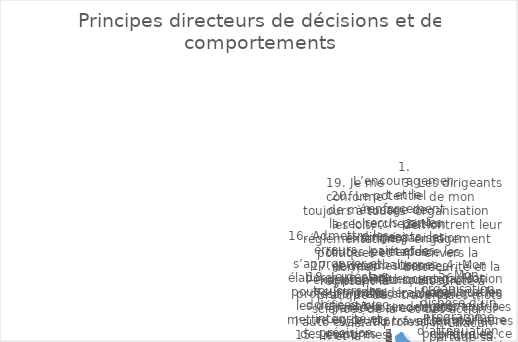
| Category | Series 0 |
|---|---|
| 1. L’encouragement et le renforcement reçus par les dirigeants, les pairs et les subalternes influencent considérablement le rendement au travail. | 2 |
| 2. Mon organisation renforce les normes éthiques et un code de conduite professionnel. | 0 |
| 3. Les dirigeants de mon organisation démontrent leur engagement envers la biosécurité et la biosûreté à travers des mots et des actions. | 0 |
| 4. Mon organisation applique les leçons apprises et les meilleures pratiques. | 1 |
| 5. Mon organisation dispose d’un programme d’atténuation des menaces internes. | 1 |
| 6. Mon organisation promeut la transparence publique en ce qui concerne sa conformité aux exigences de biosécurité et de biosûreté. | 0 |
| 7. Chacun partage sa responsabilité personnelle en matière de de biosécurité et de biosûreté. | 3 |
| 8. Je connais le concept et les implications de la recherche préoccupante à double usage. | 5 |
| 9. Des personnes dûment qualifiées et formées assurent la surveillance de la biosécurité et de la biosûreté. | 5 |
| 10. Lorsqu’un incident ou un quasi-accident se produit, les gens procèdent à un remue-méninge au lieu de se blâmer. La question posée est « qu’est-ce qui a mal tourné ? » pas « qui avait tort ? », en se concentrant sur l’amélioration, pas sur le blâme. | 4 |
| 11. Je considère les implications et les applications possibles de mon travail et l’équilibre entre la recherche de connaissances scientifiques et mes responsabilités éthiques envers la société. | 4 |
| 12. Je suis motivé pour minimiser les risques de mésusage de la science pour la société. | 4 |
| 13. Je suis conscient de la menace du bioterrorisme et des armes biologiques. | 2 |
| 14. Mon organisation a mis en place un code de conduite responsable. | 0 |
| 15. Les normes sont appliquées dans mon organisation. | 1 |
| 16. Admettre les erreurs, s’approprier et élaborer un plan pour surmonter les défis et/ou mettre en œuvre des mesures correctives font partie intégrante d’une biosécurité et d’une biosûreté efficaces. | 1 |
| 17. Je vise l’excellence professionnelle par l’auto-évaluation et la formation continue. | 4 |
| 18. Je déclare toujours les données avec intégrité et précision. | 5 |
| 19. Je me conforme toujours à toutes les lois, réglementations, politiques et normes régissant la pratique des sciences de la vie. | 4 |
| 20. Le potentiel de mésusage de la recherche est examiné à toutes les étapes et des mesures appropriées sont prises si nécessaire. | 5 |